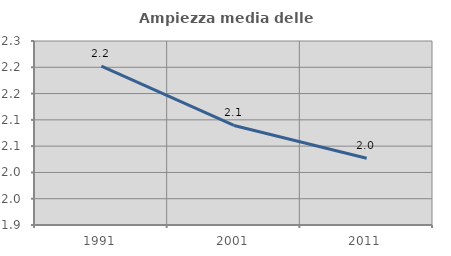
| Category | Ampiezza media delle famiglie |
|---|---|
| 1991.0 | 2.202 |
| 2001.0 | 2.089 |
| 2011.0 | 2.027 |